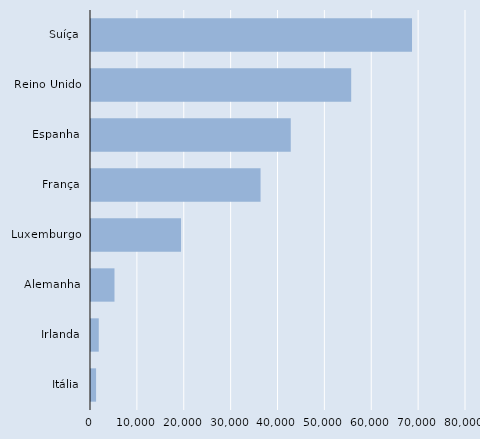
| Category | Series 0 |
|---|---|
| Suíça | 68483 |
| Reino Unido | 55509 |
| Espanha | 42616 |
| França | 36173 |
| Luxemburgo | 19207 |
| Alemanha | 5010 |
| Irlanda | 1656 |
| Itália | 1083 |